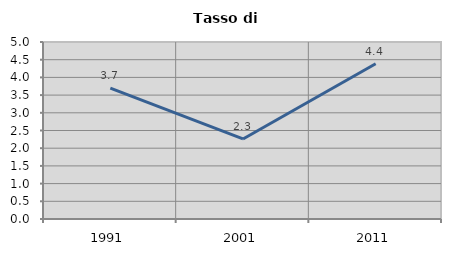
| Category | Tasso di disoccupazione   |
|---|---|
| 1991.0 | 3.695 |
| 2001.0 | 2.262 |
| 2011.0 | 4.384 |